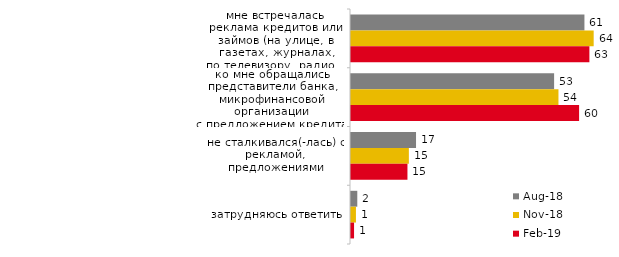
| Category | авг.18 | ноя.18 | фев.19 |
|---|---|---|---|
| мне встречалась реклама кредитов или займов (на улице, в газетах, журналах, по телевизору, радио, в интернете и т.п.) | 61.2 | 63.623 | 62.5 |
| ко мне обращались представители банка, микрофинансовой организации с предложением кредита, займа (лично, по телефону, через СМС, в офисе банка и т.п.) | 53.25 | 54.391 | 59.8 |
| не сталкивался(-лась) с рекламой, предложениями | 17.05 | 15.17 | 14.8 |
| затрудняюсь ответить | 1.65 | 1.297 | 0.8 |